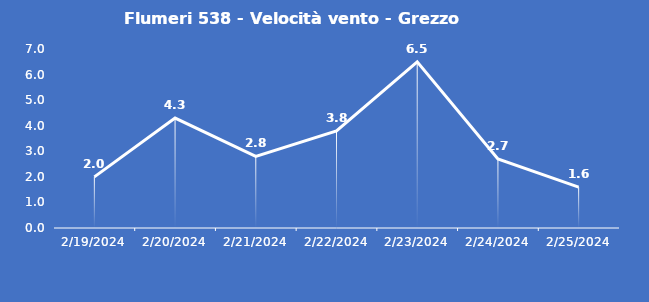
| Category | Flumeri 538 - Velocità vento - Grezzo (m/s) |
|---|---|
| 2/19/24 | 2 |
| 2/20/24 | 4.3 |
| 2/21/24 | 2.8 |
| 2/22/24 | 3.8 |
| 2/23/24 | 6.5 |
| 2/24/24 | 2.7 |
| 2/25/24 | 1.6 |